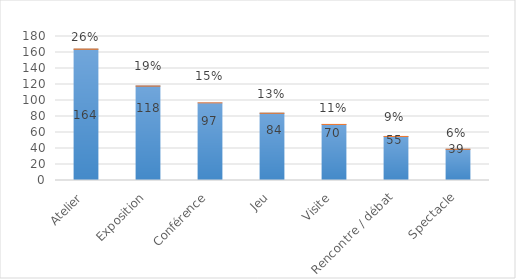
| Category | Atelier |
|---|---|
| Atelier | 0.262 |
| Exposition | 0.188 |
| Conférence | 0.155 |
| Jeu | 0.134 |
| Visite | 0.112 |
| Rencontre / débat | 0.088 |
| Spectacle | 0.062 |